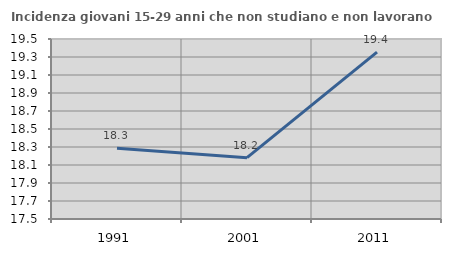
| Category | Incidenza giovani 15-29 anni che non studiano e non lavorano  |
|---|---|
| 1991.0 | 18.285 |
| 2001.0 | 18.182 |
| 2011.0 | 19.355 |